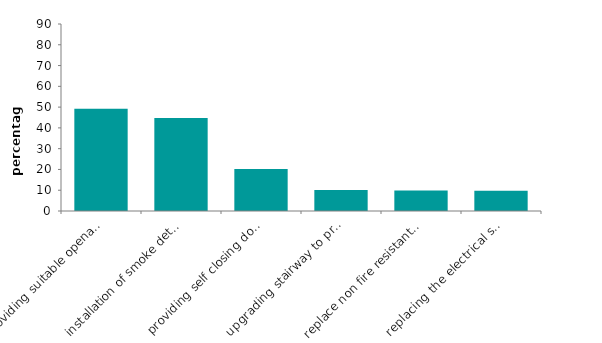
| Category | Series 0 |
|---|---|
| providing suitable openable windows | 49.16 |
| installation of smoke detectors | 44.783 |
| providing self closing doors | 20.216 |
| upgrading stairway to protected route | 10.156 |
| replace non fire resistant/smoke permeable structure | 9.88 |
| replacing the electrical system  | 9.72 |